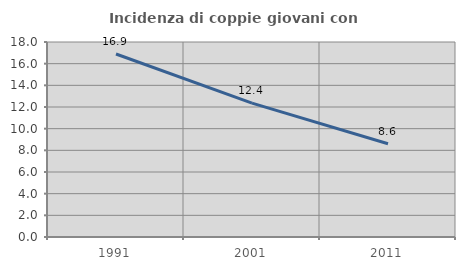
| Category | Incidenza di coppie giovani con figli |
|---|---|
| 1991.0 | 16.895 |
| 2001.0 | 12.363 |
| 2011.0 | 8.61 |